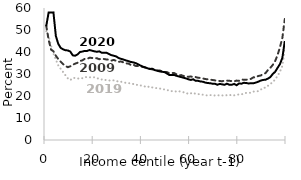
| Category | 2019 | 2009 | 2020 |
|---|---|---|---|
| 0.0 | 49.4 | 52 | 51.7 |
| 1.0 | 47.3 | 45.6 | 57.9 |
| 2.0 | 42.8 | 41.1 | 57.9 |
| 3.0 | 39.3 | 40.3 | 58 |
| 4.0 | 36.5 | 38.3 | 47.3 |
| 5.0 | 33.9 | 36.8 | 43.7 |
| 6.0 | 32.4 | 35.6 | 41.9 |
| 7.0 | 30.9 | 34.5 | 41.2 |
| 8.0 | 29.4 | 33.6 | 40.8 |
| 9.0 | 28 | 33.1 | 40.7 |
| 10.0 | 27.2 | 33.5 | 40.2 |
| 11.0 | 28.2 | 34.2 | 38.5 |
| 12.0 | 28.2 | 34.7 | 38.3 |
| 13.0 | 27.9 | 35.1 | 38.9 |
| 14.0 | 28.1 | 35.9 | 40 |
| 15.0 | 28.1 | 36.2 | 40.2 |
| 16.0 | 28.6 | 36.9 | 40.5 |
| 17.0 | 28.6 | 36.9 | 40.5 |
| 18.0 | 28.5 | 37.4 | 40.9 |
| 19.0 | 28.5 | 37.3 | 40.6 |
| 20.0 | 28.5 | 37.1 | 40.3 |
| 21.0 | 28.2 | 37.2 | 40.1 |
| 22.0 | 27.7 | 36.7 | 40.3 |
| 23.0 | 27.5 | 37 | 39.7 |
| 24.0 | 27.6 | 36.8 | 39.7 |
| 25.0 | 27.1 | 36.6 | 39.7 |
| 26.0 | 27 | 36.5 | 39.1 |
| 27.0 | 27.2 | 36.1 | 38.6 |
| 28.0 | 27.1 | 36.4 | 38.3 |
| 29.0 | 26.8 | 36 | 38 |
| 30.0 | 26.6 | 35.5 | 37.3 |
| 31.0 | 26.5 | 35.7 | 36.9 |
| 32.0 | 26.2 | 35.3 | 36.6 |
| 33.0 | 26 | 34.8 | 36.2 |
| 34.0 | 25.8 | 34.8 | 35.9 |
| 35.0 | 25.8 | 34.2 | 35.5 |
| 36.0 | 25.5 | 34.4 | 35.3 |
| 37.0 | 25 | 33.7 | 35 |
| 38.0 | 25.1 | 33.6 | 34.5 |
| 39.0 | 24.8 | 33.6 | 33.9 |
| 40.0 | 24.7 | 33.2 | 33.4 |
| 41.0 | 24.3 | 33 | 33 |
| 42.0 | 24.5 | 32.7 | 32.6 |
| 43.0 | 23.8 | 32.3 | 32.3 |
| 44.0 | 23.9 | 32.1 | 32.4 |
| 45.0 | 23.6 | 32 | 31.8 |
| 46.0 | 23.6 | 31.6 | 31.5 |
| 47.0 | 23.5 | 31.6 | 31.2 |
| 48.0 | 23 | 31.3 | 31 |
| 49.0 | 23 | 30.9 | 30.9 |
| 50.0 | 22.6 | 30.9 | 30.3 |
| 51.0 | 22.6 | 30.4 | 29.6 |
| 52.0 | 22.2 | 30.4 | 29.6 |
| 53.0 | 22.3 | 30.5 | 29.6 |
| 54.0 | 22 | 29.9 | 29.2 |
| 55.0 | 22.2 | 29.4 | 28.9 |
| 56.0 | 21.9 | 29.5 | 28.6 |
| 57.0 | 21.7 | 29.1 | 28.3 |
| 58.0 | 21.5 | 29 | 28 |
| 59.0 | 20.9 | 28.7 | 27.6 |
| 60.0 | 21.2 | 28.9 | 27.3 |
| 61.0 | 21.5 | 28.5 | 27.6 |
| 62.0 | 20.9 | 28.6 | 26.9 |
| 63.0 | 20.9 | 28.3 | 26.9 |
| 64.0 | 20.7 | 28.2 | 26.6 |
| 65.0 | 20.6 | 28 | 26.5 |
| 66.0 | 20.4 | 27.7 | 26.1 |
| 67.0 | 20.2 | 27.6 | 25.9 |
| 68.0 | 20.4 | 27.4 | 25.8 |
| 69.0 | 20.4 | 27.3 | 25.6 |
| 70.0 | 20.2 | 27.1 | 25.6 |
| 71.0 | 20.4 | 26.9 | 25.1 |
| 72.0 | 20.2 | 26.8 | 25.5 |
| 73.0 | 20.3 | 26.7 | 25.3 |
| 74.0 | 20.1 | 27 | 25.1 |
| 75.0 | 20.4 | 27 | 25.6 |
| 76.0 | 20.3 | 26.9 | 25.1 |
| 77.0 | 20.6 | 26.8 | 25.1 |
| 78.0 | 20.3 | 26.7 | 25.5 |
| 79.0 | 20.5 | 27 | 24.9 |
| 80.0 | 20.7 | 26.9 | 25.7 |
| 81.0 | 20.7 | 27.5 | 25.6 |
| 82.0 | 21.2 | 27.4 | 26 |
| 83.0 | 21.4 | 27.4 | 25.9 |
| 84.0 | 21.4 | 27.6 | 25.7 |
| 85.0 | 21.5 | 27.8 | 25.8 |
| 86.0 | 22 | 28.5 | 25.8 |
| 87.0 | 22.1 | 28.4 | 26.1 |
| 88.0 | 22.2 | 29.1 | 26.5 |
| 89.0 | 23 | 29.3 | 27 |
| 90.0 | 23.1 | 30 | 27.3 |
| 91.0 | 24.1 | 30.4 | 27.4 |
| 92.0 | 24.6 | 31.8 | 27.9 |
| 93.0 | 25.5 | 32.8 | 28.6 |
| 94.0 | 26.2 | 34.1 | 30 |
| 95.0 | 27.6 | 35.9 | 31 |
| 96.0 | 29.1 | 38.6 | 32.8 |
| 97.0 | 31.1 | 42.2 | 34.5 |
| 98.0 | 33.7 | 46.4 | 37.4 |
| 99.0 | 41.4 | 55 | 45 |